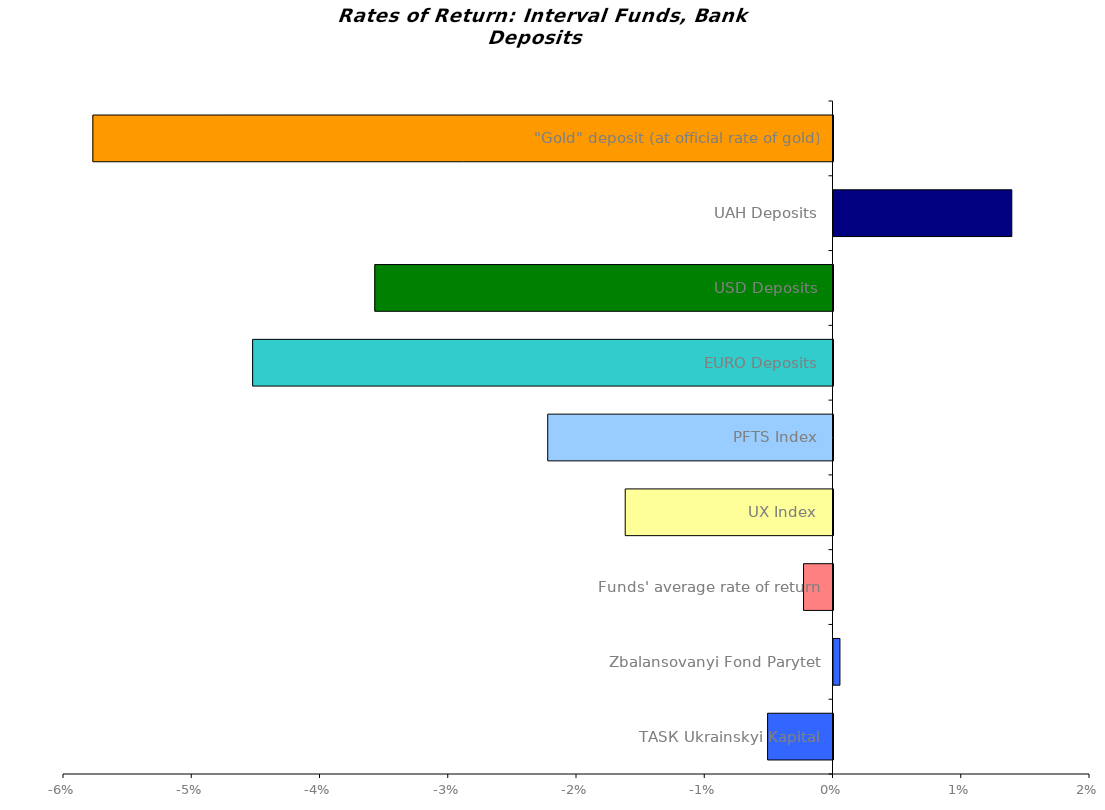
| Category | Series 0 |
|---|---|
| ТАSК Ukrainskyi Kapital | -0.005 |
| Zbalansovanyi Fond Parytet | 0.001 |
| Funds' average rate of return | -0.002 |
| UX Index | -0.016 |
| PFTS Index | -0.022 |
| EURO Deposits | -0.045 |
| USD Deposits | -0.036 |
| UAH Deposits | 0.014 |
| "Gold" deposit (at official rate of gold) | -0.058 |